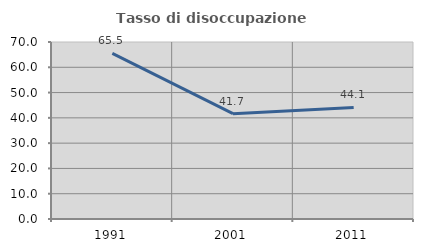
| Category | Tasso di disoccupazione giovanile  |
|---|---|
| 1991.0 | 65.517 |
| 2001.0 | 41.667 |
| 2011.0 | 44.144 |